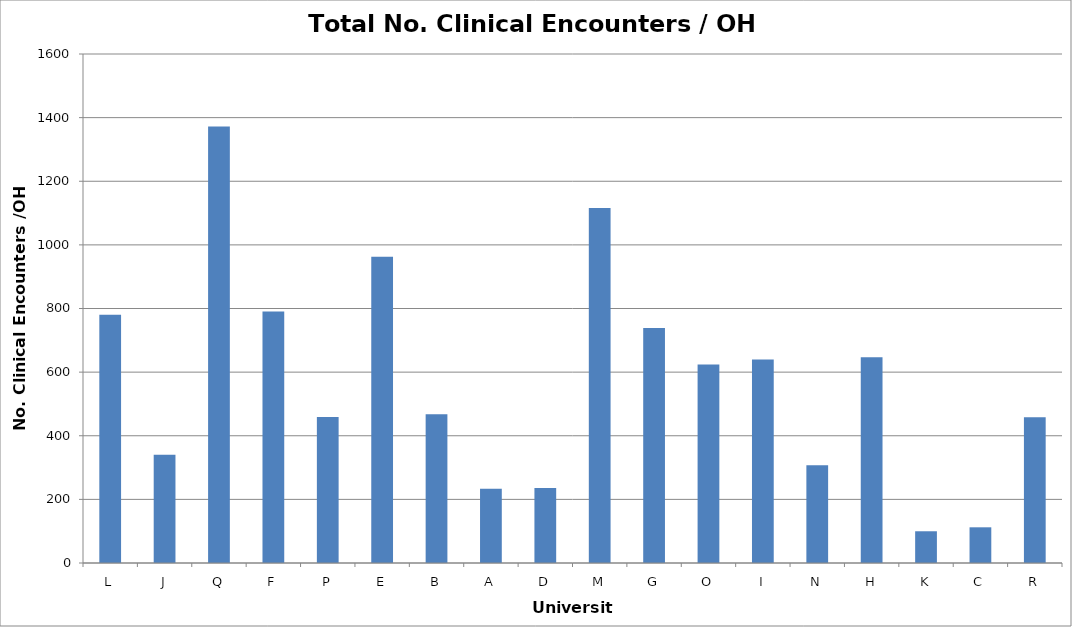
| Category | No. Clinical Encounters / OH FTE |
|---|---|
| L | 780.256 |
| J | 340.222 |
| Q | 1372.222 |
| F | 790.698 |
| P | 458.81 |
| E | 962.679 |
| B | 467.326 |
| A | 233.478 |
| D | 235.928 |
| M | 1115.789 |
| G | 738.534 |
| O | 623.81 |
| I | 640 |
| N | 307.222 |
| H | 646.757 |
| K | 99.756 |
| C | 112.207 |
| R | 458.039 |